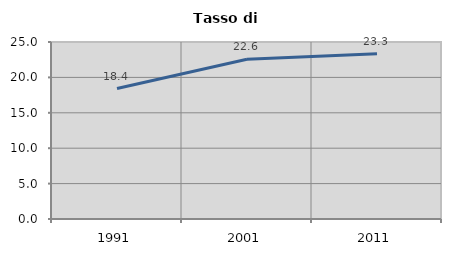
| Category | Tasso di disoccupazione   |
|---|---|
| 1991.0 | 18.428 |
| 2001.0 | 22.563 |
| 2011.0 | 23.342 |